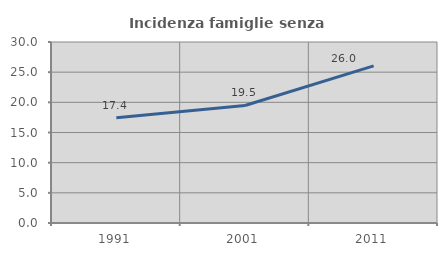
| Category | Incidenza famiglie senza nuclei |
|---|---|
| 1991.0 | 17.439 |
| 2001.0 | 19.484 |
| 2011.0 | 26.038 |